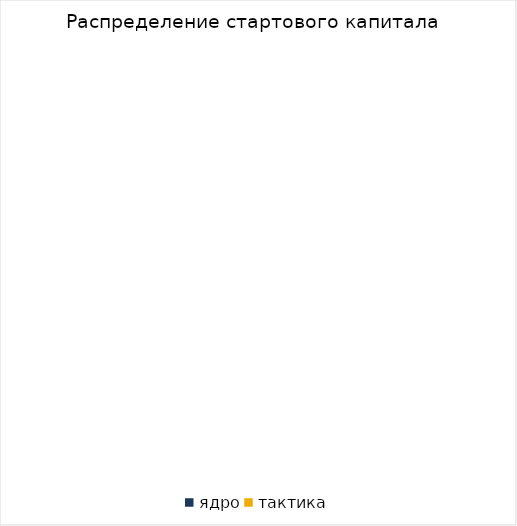
| Category | ядро |
|---|---|
| ядро | 0 |
| тактика | 0 |